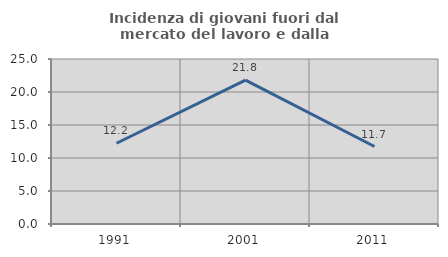
| Category | Incidenza di giovani fuori dal mercato del lavoro e dalla formazione  |
|---|---|
| 1991.0 | 12.233 |
| 2001.0 | 21.809 |
| 2011.0 | 11.738 |